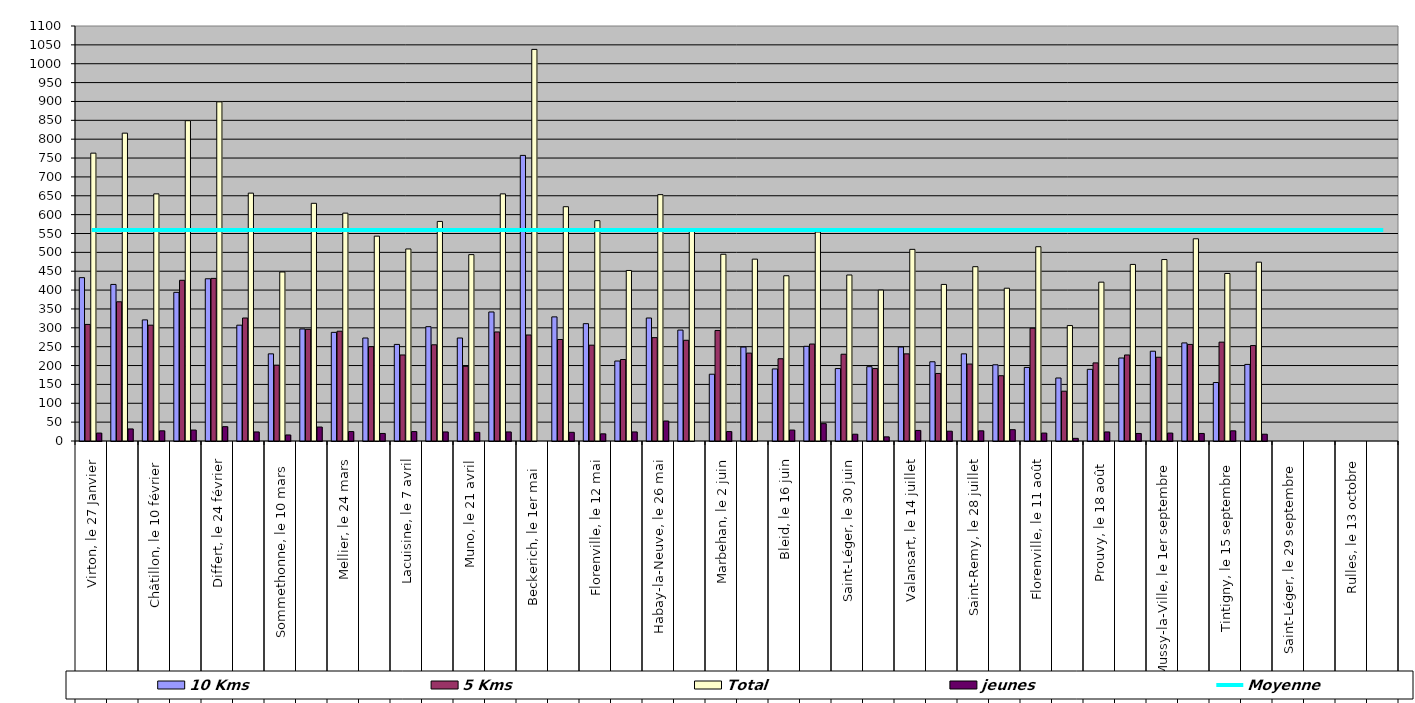
| Category | 10 Kms | 5 Kms | Total | jeunes |
|---|---|---|---|---|
| 0 | 433 | 309 | 763 | 21 |
| 1 | 415 | 369 | 816 | 32 |
| 2 | 321 | 307 | 655 | 27 |
| 3 | 394 | 426 | 849 | 29 |
| 4 | 430 | 431 | 899 | 38 |
| 5 | 307 | 326 | 657 | 24 |
| 6 | 231 | 201 | 448 | 16 |
| 7 | 297 | 296 | 630 | 37 |
| 8 | 288 | 291 | 604 | 25 |
| 9 | 273 | 250 | 543 | 20 |
| 10 | 256 | 228 | 509 | 25 |
| 11 | 303 | 255 | 582 | 24 |
| 12 | 273 | 198 | 494 | 23 |
| 13 | 342 | 289 | 655 | 24 |
| 14 | 757 | 281 | 1038 | 0 |
| 15 | 329 | 269 | 621 | 23 |
| 16 | 311 | 254 | 584 | 19 |
| 17 | 212 | 216 | 452 | 24 |
| 18 | 326 | 274 | 653 | 53 |
| 19 | 294 | 267 | 561 | 0 |
| 20 | 177 | 293 | 495 | 25 |
| 21 | 249 | 233 | 482 | 0 |
| 22 | 191 | 218 | 438 | 29 |
| 23 | 251 | 257 | 554 | 46 |
| 24 | 192 | 230 | 440 | 18 |
| 25 | 197 | 192 | 400 | 11 |
| 26 | 249 | 231 | 508 | 28 |
| 27 | 210 | 179 | 415 | 26 |
| 28 | 231 | 204 | 462 | 27 |
| 29 | 202 | 173 | 405 | 30 |
| 30 | 195 | 299 | 515 | 21 |
| 31 | 167 | 132 | 306 | 7 |
| 32 | 190 | 207 | 421 | 24 |
| 33 | 220 | 228 | 468 | 20 |
| 34 | 238 | 222 | 481 | 21 |
| 35 | 260 | 256 | 536 | 20 |
| 36 | 155 | 262 | 444 | 27 |
| 37 | 203 | 253 | 474 | 18 |
| 38 | 0 | 0 | 0 | 0 |
| 39 | 0 | 0 | 0 | 0 |
| 40 | 0 | 0 | 0 | 0 |
| 41 | 0 | 0 | 0 | 0 |